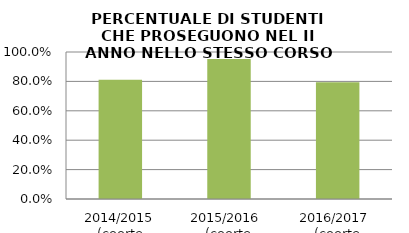
| Category | 2014/2015 (coorte 2013/14) 2015/2016  (coorte 2014/15) 2016/2017  (coorte 2015/16) |
|---|---|
| 2014/2015 (coorte 2013/14) | 0.811 |
| 2015/2016  (coorte 2014/15) | 0.952 |
| 2016/2017  (coorte 2015/16) | 0.795 |